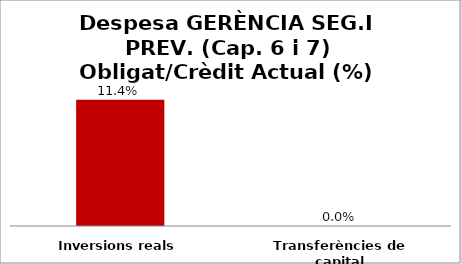
| Category | Series 0 |
|---|---|
| Inversions reals | 0.114 |
| Transferències de capital | 0 |